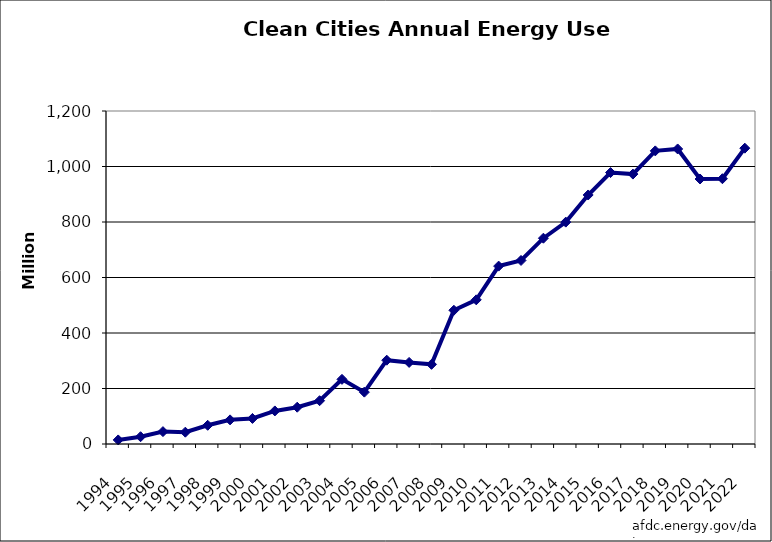
| Category | Series 0 |
|---|---|
| 1994.0 | 14.662 |
| 1995.0 | 26.257 |
| 1996.0 | 44.636 |
| 1997.0 | 42.602 |
| 1998.0 | 67.43 |
| 1999.0 | 86.993 |
| 2000.0 | 92.062 |
| 2001.0 | 119.18 |
| 2002.0 | 132.561 |
| 2003.0 | 156.054 |
| 2004.0 | 233 |
| 2005.0 | 186.9 |
| 2006.0 | 302 |
| 2007.0 | 294 |
| 2008.0 | 287 |
| 2009.0 | 482 |
| 2010.0 | 519.5 |
| 2011.0 | 641 |
| 2012.0 | 661.4 |
| 2013.0 | 741.6 |
| 2014.0 | 799.5 |
| 2015.0 | 897.4 |
| 2016.0 | 978.2 |
| 2017.0 | 972.6 |
| 2018.0 | 1056.3 |
| 2019.0 | 1063.2 |
| 2020.0 | 955 |
| 2021.0 | 956 |
| 2022.0 | 1066 |